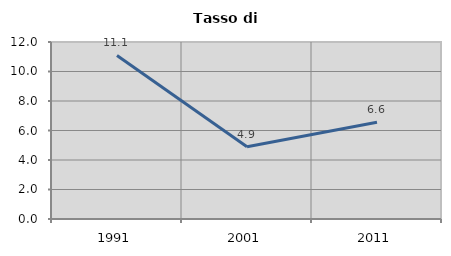
| Category | Tasso di disoccupazione   |
|---|---|
| 1991.0 | 11.09 |
| 2001.0 | 4.895 |
| 2011.0 | 6.562 |